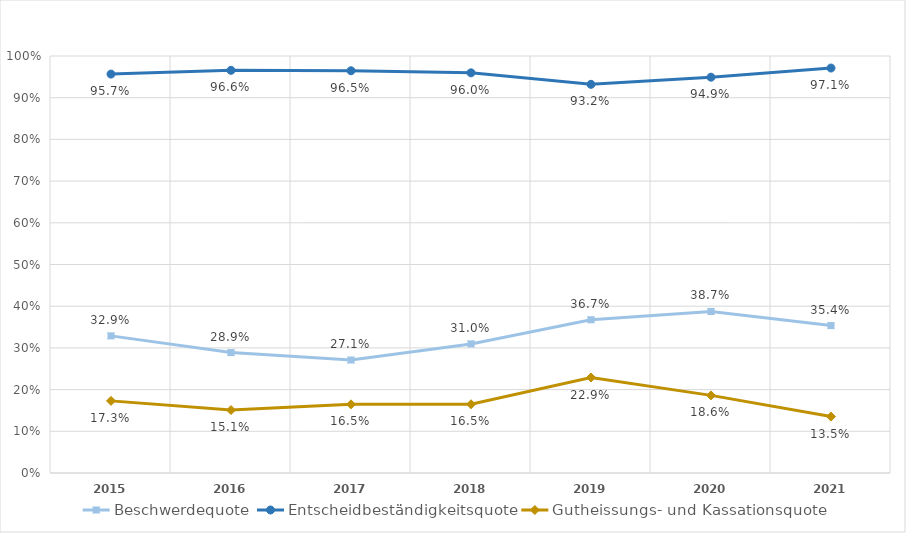
| Category | Beschwerdequote | Entscheidbeständigkeitsquote | Gutheissungs- und Kassationsquote |
|---|---|---|---|
| 2015.0 | 0.329 | 0.957 | 0.173 |
| 2016.0 | 0.289 | 0.966 | 0.151 |
| 2017.0 | 0.271 | 0.965 | 0.165 |
| 2018.0 | 0.31 | 0.96 | 0.165 |
| 2019.0 | 0.367 | 0.932 | 0.229 |
| 2020.0 | 0.387 | 0.949 | 0.186 |
| 2021.0 | 0.354 | 0.971 | 0.135 |